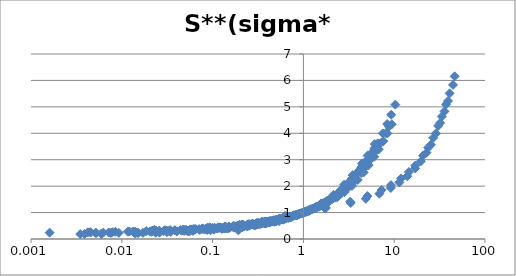
| Category | S** |
|---|---|
| 0.0075466634771276095 | 0.225 |
| 0.021220572204023003 | 0.279 |
| 0.03861139730799259 | 0.323 |
| 0.06188005279311166 | 0.365 |
| 0.08577620376294451 | 0.4 |
| 0.11466517906634513 | 0.435 |
| 0.1399859223104047 | 0.462 |
| 0.17090333104009162 | 0.492 |
| 0.2086427685925926 | 0.525 |
| 0.24565830026734728 | 0.555 |
| 0.27892113519801315 | 0.581 |
| 0.3166781145228119 | 0.608 |
| 0.34051342073052143 | 0.625 |
| 0.38661990967517096 | 0.656 |
| 0.4233336416764669 | 0.679 |
| 0.45519655393546915 | 0.699 |
| 0.4984070513897244 | 0.726 |
| 0.5359369694354579 | 0.748 |
| 0.19197558430818895 | 0.328 |
| 0.5390724356409355 | 0.676 |
| 0.9983303109589039 | 0.999 |
| 1.57055595422668 | 1.346 |
| 2.137110185530913 | 1.668 |
| 2.8047171235752995 | 2.055 |
| 3.486134425267791 | 2.417 |
| 4.412332401409125 | 2.856 |
| 5.1009042116519305 | 3.161 |
| 6.115109497646853 | 3.592 |
| 0.01708425641617511 | 0.233 |
| 0.048908808872249965 | 0.31 |
| 0.08899361929019356 | 0.37 |
| 0.1400505864612474 | 0.428 |
| 0.19413376523100473 | 0.485 |
| 0.25484145161492106 | 0.542 |
| 0.3168341415521856 | 0.593 |
| 0.3939192764339146 | 0.651 |
| 0.4722707119925078 | 0.704 |
| 0.5560396535301501 | 0.757 |
| 0.6313484239031558 | 0.802 |
| 0.7039417080550201 | 0.844 |
| 0.7849301384844628 | 0.888 |
| 0.8594148667170121 | 0.928 |
| 0.9758120992558272 | 0.988 |
| 1.0684102751386144 | 1.034 |
| 1.1912575140917367 | 1.094 |
| 0.013859796173066702 | 0.222 |
| 0.04040951642187007 | 0.287 |
| 0.07220374056399292 | 0.343 |
| 0.11158780373486205 | 0.401 |
| 0.15189745288530407 | 0.45 |
| 0.20676208254160425 | 0.505 |
| 0.26177522498051287 | 0.554 |
| 0.31959112169676934 | 0.6 |
| 0.36951074524365735 | 0.637 |
| 0.4350392760291427 | 0.683 |
| 0.4939600251766626 | 0.721 |
| 0.5711157933754621 | 0.769 |
| 0.6367834493043567 | 0.807 |
| 0.7228501293014425 | 0.855 |
| 0.8206756246432336 | 0.908 |
| 0.8985799973429711 | 0.949 |
| 0.009281222510243688 | 0.232 |
| 0.026096398801271566 | 0.29 |
| 0.04923989668107248 | 0.342 |
| 0.07610752274357488 | 0.386 |
| 0.1055011241524047 | 0.424 |
| 0.13849670295851213 | 0.461 |
| 0.1690852014475782 | 0.491 |
| 0.21799454567363322 | 0.534 |
| 0.25202169508101535 | 0.561 |
| 0.3021772562384435 | 0.599 |
| 0.35579778018186853 | 0.636 |
| 0.39669568461005356 | 0.664 |
| 0.46707388069117467 | 0.708 |
| 0.5499548576207796 | 0.758 |
| 0.6593623992762033 | 0.821 |
| 0.0016043594855284702 | 0.24 |
| 0.0045115991122611455 | 0.258 |
| 0.008512956417918447 | 0.274 |
| 0.013399026550743402 | 0.287 |
| 0.018573884849913683 | 0.299 |
| 0.023944331239111716 | 0.31 |
| 0.03086948505616763 | 0.322 |
| 0.03837643063848488 | 0.333 |
| 0.0443721323796051 | 0.341 |
| 0.051307721799947394 | 0.351 |
| 0.05932555467528562 | 0.361 |
| 0.07113210365019876 | 0.374 |
| 0.07788686439776767 | 0.382 |
| 0.08528568515845149 | 0.389 |
| 0.09509194702969705 | 0.399 |
| 0.104115549875788 | 0.408 |
| 0.11822399854795293 | 0.421 |
| 0.021952966135933925 | 0.309 |
| 0.06520226203457254 | 0.377 |
| 0.11652134310318926 | 0.429 |
| 0.18010645997662145 | 0.481 |
| 0.2542462352709412 | 0.539 |
| 0.3337825195062551 | 0.604 |
| 0.422565972423765 | 0.668 |
| 0.515910113688255 | 0.73 |
| 0.6074382662495363 | 0.786 |
| 0.7152045240330626 | 0.849 |
| 0.8269691891597217 | 0.91 |
| 0.9389143042374182 | 0.969 |
| 1.066111546972064 | 1.033 |
| 1.1887310294416344 | 1.093 |
| 1.3253721518456603 | 1.158 |
| 1.477856099145041 | 1.228 |
| 0.004235350982501991 | 0.253 |
| 0.01213204905129912 | 0.286 |
| 0.021681550268658183 | 0.312 |
| 0.03412687522050281 | 0.337 |
| 0.04730852205987941 | 0.359 |
| 0.062106217986255124 | 0.38 |
| 0.07863322395925916 | 0.401 |
| 0.09955514879637432 | 0.424 |
| 0.11510550427460212 | 0.44 |
| 0.13551815716095397 | 0.46 |
| 0.1511002156853149 | 0.474 |
| 0.1878741607682103 | 0.506 |
| 0.20947618244290406 | 0.523 |
| 0.24218858037723706 | 0.548 |
| 0.2749985178835331 | 0.573 |
| 0.3066370727226147 | 0.595 |
| 0.004529644152677238 | 0.248 |
| 0.011635932001145485 | 0.278 |
| 0.025855084598523818 | 0.314 |
| 0.05745009506166039 | 0.365 |
| 0.1347936205643146 | 0.45 |
| 0.30494139394427244 | 0.582 |
| 0.6290921969929653 | 0.869 |
| 1.7688990527818802 | 1.177 |
| 3.2774079822573605 | 1.411 |
| 5.064782848287406 | 1.625 |
| 7.279726023207398 | 1.854 |
| 9.215224141546113 | 2.039 |
| 11.878980129114089 | 2.288 |
| 14.501689771366161 | 2.533 |
| 17.07392466082056 | 2.779 |
| 20.844886044979933 | 3.157 |
| 23.665159806699503 | 3.457 |
| 26.869489981586952 | 3.827 |
| 30.506757472925134 | 4.282 |
| 33.402676070560815 | 4.635 |
| 37.2433603324017 | 5.094 |
| 40.780019246889395 | 5.511 |
| 46.30459799008378 | 6.154 |
| 0.6263164214164751 | 0.856 |
| 1.7294187575252837 | 1.155 |
| 3.3228118220598355 | 1.362 |
| 4.863276716694662 | 1.523 |
| 6.864371850270137 | 1.716 |
| 9.175974090994982 | 1.931 |
| 11.407067659393464 | 2.137 |
| 13.926013984013931 | 2.374 |
| 17.00015676600244 | 2.672 |
| 19.654949719502525 | 2.941 |
| 22.725021521314616 | 3.268 |
| 25.337195655262562 | 3.567 |
| 28.767039621102526 | 3.993 |
| 32.07471221892385 | 4.393 |
| 35.761605695944866 | 4.828 |
| 39.15635189629454 | 5.222 |
| 44.45960085503688 | 5.83 |
| 0.014833127317676144 | 0.234 |
| 0.06032138442521632 | 0.316 |
| 0.13597033374536466 | 0.4 |
| 0.24103831891223737 | 0.498 |
| 0.37453646477132263 | 0.608 |
| 0.5438813349814586 | 0.721 |
| 0.7404202719406675 | 0.85 |
| 0.9604449938195303 | 0.98 |
| 1.207663782447466 | 1.118 |
| 1.508034610630408 | 1.275 |
| 1.8046971569839307 | 1.433 |
| 2.2002472187886277 | 1.637 |
| 2.5587144622991342 | 1.838 |
| 2.954264524103832 | 2.052 |
| 3.3745364647713227 | 2.264 |
| 3.8936959208899875 | 2.51 |
| 4.351050679851669 | 2.716 |
| 4.857849196538937 | 2.935 |
| 5.339925834363411 | 3.137 |
| 6.069221260815822 | 3.433 |
| 0.025965665236051504 | 0.24 |
| 0.10386266094420601 | 0.354 |
| 0.2381974248927039 | 0.485 |
| 0.4206008583690987 | 0.642 |
| 0.6545064377682404 | 0.795 |
| 0.9356223175965667 | 0.972 |
| 1.2832618025751072 | 1.156 |
| 1.667381974248927 | 1.348 |
| 2.0793991416309012 | 1.558 |
| 2.575107296137339 | 1.777 |
| 3.0901287553648067 | 2.015 |
| 3.733905579399142 | 2.305 |
| 4.377682403433476 | 2.593 |
| 5.085836909871245 | 2.935 |
| 5.858369098712446 | 3.296 |
| 6.587982832618025 | 3.62 |
| 7.489270386266094 | 3.996 |
| 8.369098712446352 | 4.35 |
| 9.270386266094421 | 4.7 |
| 10.278969957081545 | 5.084 |
| 0.021778584392014518 | 0.319 |
| 0.08784029038112523 | 0.428 |
| 0.19782214156079858 | 0.541 |
| 0.3484573502722323 | 0.656 |
| 0.5408348457350273 | 0.773 |
| 0.7858439201451906 | 0.902 |
| 1.0780399274047188 | 1.045 |
| 1.399274047186933 | 1.193 |
| 1.7731397459165155 | 1.365 |
| 2.232304900181488 | 1.565 |
| 2.6497277676951 | 1.741 |
| 3.176043557168784 | 1.969 |
| 3.7205081669691467 | 2.21 |
| 4.337568058076225 | 2.497 |
| 4.882032667876589 | 2.743 |
| 5.571687840290381 | 3.035 |
| 6.333938294010889 | 3.342 |
| 7.078039927404719 | 3.628 |
| 8.09437386569873 | 4.007 |
| 8.765880217785844 | 4.252 |
| 0.022957198443579768 | 0.343 |
| 0.09280155642023345 | 0.442 |
| 0.21206225680933857 | 0.551 |
| 0.3754863813229573 | 0.666 |
| 0.5894941634241245 | 0.794 |
| 0.8424124513618678 | 0.925 |
| 1.1478599221789885 | 1.063 |
| 1.4883268482490275 | 1.221 |
| 1.8735408560311289 | 1.384 |
| 2.3540856031128405 | 1.577 |
| 2.840466926070039 | 1.774 |
| 3.4241245136186778 | 2.01 |
| 3.96887159533074 | 2.235 |
| 4.610894941634242 | 2.522 |
| 5.233463035019457 | 2.793 |
| 6.0311284046692615 | 3.113 |
| 6.750972762645915 | 3.39 |
| 7.587548638132296 | 3.699 |
| 8.40466926070039 | 3.993 |
| 9.396887159533074 | 4.341 |
| 0.02982456140350877 | 0.331 |
| 0.12030075187969924 | 0.442 |
| 0.2706766917293233 | 0.564 |
| 0.48120300751879697 | 0.706 |
| 0.7593984962406015 | 0.868 |
| 1.0852130325814537 | 1.048 |
| 1.463659147869674 | 1.249 |
| 1.9147869674185463 | 1.475 |
| 2.411027568922306 | 1.74 |
| 3.0325814536340854 | 2.07 |
| 3.6591478696741855 | 2.375 |
| 4.335839598997493 | 2.678 |
| 5.06265664160401 | 2.985 |
| 5.93984962406015 | 3.34 |
| 0.0038782051282051284 | 0.191 |
| 0.015288461538461535 | 0.23 |
| 0.03461538461538462 | 0.268 |
| 0.060897435897435896 | 0.309 |
| 0.0955128205128205 | 0.351 |
| 0.1394230769230769 | 0.396 |
| 0.18846153846153846 | 0.442 |
| 0.24455128205128204 | 0.493 |
| 0.3121794871794872 | 0.555 |
| 0.38461538461538464 | 0.616 |
| 0.46474358974358976 | 0.678 |
| 0.5512820512820513 | 0.74 |
| 0.6506410256410255 | 0.804 |
| 0.7564102564102564 | 0.867 |
| 0.8589743589743589 | 0.926 |
| 0.9903846153846154 | 0.995 |
| 1.1057692307692308 | 1.054 |
| 1.2628205128205128 | 1.131 |
| 1.3782051282051282 | 1.185 |
| 1.5384615384615385 | 1.258 |
| 0.0034883720930232558 | 0.186 |
| 0.014215116279069769 | 0.223 |
| 0.031395348837209305 | 0.26 |
| 0.0561046511627907 | 0.298 |
| 0.0872093023255814 | 0.341 |
| 0.126453488372093 | 0.383 |
| 0.17093023255813952 | 0.428 |
| 0.22354651162790698 | 0.479 |
| 0.28313953488372096 | 0.537 |
| 0.3488372093023256 | 0.594 |
| 0.4273255813953488 | 0.656 |
| 0.5000000000000001 | 0.708 |
| 0.5843023255813953 | 0.765 |
| 0.686046511627907 | 0.828 |
| 0.7906976744186046 | 0.888 |
| 0.8953488372093024 | 0.946 |
| 1.0087209302325582 | 1.005 |
| 1.127906976744186 | 1.064 |
| 1.2587209302325582 | 1.128 |
| 1.4069767441860466 | 1.197 |
| 0.0051271186440677964 | 0.234 |
| 0.020381355932203395 | 0.282 |
| 0.04576271186440678 | 0.322 |
| 0.08093220338983051 | 0.365 |
| 0.1271186440677966 | 0.415 |
| 0.18305084745762712 | 0.462 |
| 0.24703389830508474 | 0.511 |
| 0.3228813559322034 | 0.566 |
| 0.41271186440677965 | 0.628 |
| 0.5127118644067796 | 0.7 |
| 0.6186440677966102 | 0.774 |
| 0.7330508474576272 | 0.847 |
| 0.8601694915254237 | 0.924 |
| 1.0 | 1.001 |
| 1.152542372881356 | 1.081 |
| 1.3177966101694916 | 1.163 |
| 1.4703389830508475 | 1.236 |
| 1.6440677966101696 | 1.316 |
| 1.8220338983050848 | 1.395 |
| 2.0508474576271185 | 1.495 |
| 0.005240174672489083 | 0.227 |
| 0.021004366812227077 | 0.273 |
| 0.04716157205240175 | 0.315 |
| 0.08515283842794762 | 0.362 |
| 0.13100436681222707 | 0.405 |
| 0.188646288209607 | 0.456 |
| 0.254585152838428 | 0.505 |
| 0.3331877729257642 | 0.562 |
| 0.43231441048034935 | 0.631 |
| 0.5283842794759825 | 0.7 |
| 0.6462882096069869 | 0.784 |
| 0.7641921397379913 | 0.862 |
| 0.8951965065502182 | 0.941 |
| 1.0305676855895196 | 1.019 |
| 1.1877729257641922 | 1.102 |
| 1.3580786026200873 | 1.187 |
| 1.51528384279476 | 1.263 |
| 1.7074235807860263 | 1.352 |
| 1.908296943231441 | 1.441 |
| 2.131004366812227 | 1.538 |
| 0.007880794701986755 | 0.258 |
| 0.032317880794701985 | 0.307 |
| 0.07152317880794702 | 0.355 |
| 0.12649006622516556 | 0.41 |
| 0.1986754966887417 | 0.47 |
| 0.2860927152317881 | 0.541 |
| 0.3887417218543046 | 0.626 |
| 0.5086092715231788 | 0.713 |
| 0.6450331125827815 | 0.802 |
| 0.7947019867549668 | 0.89 |
| 0.9735099337748344 | 0.986 |
| 1.1390728476821192 | 1.07 |
| 1.357615894039735 | 1.175 |
| 1.576158940397351 | 1.275 |
| 0.00595 | 0.203 |
| 0.023650000000000004 | 0.25 |
| 0.0535 | 0.299 |
| 0.095 | 0.349 |
| 0.1485 | 0.404 |
| 0.215 | 0.461 |
| 0.2895 | 0.52 |
| 0.381 | 0.586 |
| 0.4835 | 0.657 |
| 0.595 | 0.733 |
| 0.72 | 0.824 |
| 0.8500000000000001 | 0.91 |
| 1.01 | 1.007 |
| 1.17 | 1.097 |
| 1.33 | 1.181 |
| 1.52 | 1.276 |
| 1.71 | 1.366 |
| 1.925 | 1.464 |
| 2.135 | 1.556 |
| 2.39 | 1.666 |
| 0.005970149253731344 | 0.188 |
| 0.02373134328358209 | 0.238 |
| 0.05323383084577115 | 0.287 |
| 0.09502487562189056 | 0.342 |
| 0.14875621890547266 | 0.397 |
| 0.2139303482587065 | 0.454 |
| 0.29253731343283584 | 0.517 |
| 0.3791044776119403 | 0.583 |
| 0.48109452736318414 | 0.655 |
| 0.5970149253731344 | 0.734 |
| 0.7164179104477613 | 0.821 |
| 0.8457711442786072 | 0.908 |
| 1.0049751243781095 | 1.003 |
| 1.164179104477612 | 1.093 |
| 1.3432835820895523 | 1.188 |
| 1.5323383084577116 | 1.282 |
| 1.711442786069652 | 1.367 |
| 1.930348258706468 | 1.466 |
| 2.139303482587065 | 1.558 |
| 2.3781094527363185 | 1.661 |
| 0.007185628742514969 | 0.247 |
| 0.028982035928143707 | 0.299 |
| 0.06347305389221557 | 0.351 |
| 0.11377245508982034 | 0.407 |
| 0.1778443113772455 | 0.463 |
| 0.25568862275449095 | 0.525 |
| 0.34670658682634725 | 0.588 |
| 0.4568862275449101 | 0.659 |
| 0.5790419161676645 | 0.738 |
| 0.7125748502994012 | 0.817 |
| 0.8622754491017963 | 0.91 |
| 1.0359281437125747 | 1.021 |
| 1.209580838323353 | 1.122 |
| 1.4011976047904189 | 1.226 |
| 1.6047904191616764 | 1.33 |
| 1.8323353293413172 | 1.439 |
| 2.0479041916167664 | 1.539 |
| 2.305389221556886 | 1.654 |
| 2.616766467065868 | 1.787 |
| 2.8802395209580838 | 1.898 |
| 0.00625 | 0.242 |
| 0.02463541666666667 | 0.285 |
| 0.05520833333333333 | 0.328 |
| 0.09791666666666667 | 0.376 |
| 0.15572916666666667 | 0.429 |
| 0.2223958333333333 | 0.484 |
| 0.3015625 | 0.54 |
| 0.39375 | 0.603 |
| 0.5036458333333333 | 0.675 |
| 0.6197916666666666 | 0.753 |
| 0.7447916666666667 | 0.837 |
| 0.890625 | 0.933 |
| 1.0572916666666665 | 1.033 |
| 1.2291666666666667 | 1.128 |
| 1.390625 | 1.212 |
| 1.6041666666666667 | 1.317 |
| 1.8072916666666667 | 1.413 |
| 2.0052083333333335 | 1.502 |
| 2.2395833333333335 | 1.605 |
| 2.484375 | 1.709 |
| 0.014066193853427894 | 0.274 |
| 0.05638297872340424 | 0.342 |
| 0.1276595744680851 | 0.414 |
| 0.2245862884160756 | 0.493 |
| 0.3534278959810874 | 0.583 |
| 0.5011820330969267 | 0.681 |
| 0.685579196217494 | 0.796 |
| 0.8947990543735224 | 0.935 |
| 1.144208037825059 | 1.087 |
| 1.4066193853427893 | 1.234 |
| 1.713947990543735 | 1.389 |
| 2.0212765957446805 | 1.534 |
| 2.387706855791962 | 1.697 |
| 2.7659574468085104 | 1.858 |